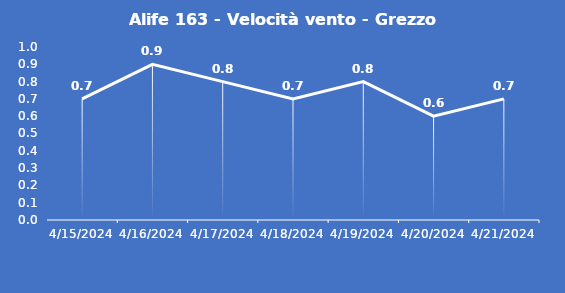
| Category | Alife 163 - Velocità vento - Grezzo (m/s) |
|---|---|
| 4/15/24 | 0.7 |
| 4/16/24 | 0.9 |
| 4/17/24 | 0.8 |
| 4/18/24 | 0.7 |
| 4/19/24 | 0.8 |
| 4/20/24 | 0.6 |
| 4/21/24 | 0.7 |